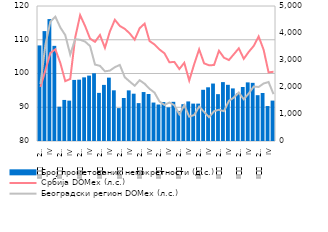
| Category | Број прометованих непокретности (д.с.) |
|---|---|
| II
     2008. | 3540 |
| III | 4071 |
| IV | 4515 |
| I
2009. | 3524 |
| II
     2009. | 1271 |
| III | 1521 |
| IV
 | 1495 |
| I
2010. | 2262 |
| II
     2010. | 2272 |
| III | 2357 |
| IV | 2422 |
| I
2011. | 2508 |
| II
     2011. | 1782 |
| III | 2078 |
| IV | 2347 |
| I
2012. | 1877 |
| II
     2012. | 1218 |
| III | 1592 |
| IV | 1875 |
| I
2013. | 1752 |
| II
     2013. | 1403 |
| III | 1813 |
| IV | 1741 |
| I
2014. | 1424 |
| II
     2014. | 1351 |
| III | 1443 |
| IV | 1247 |
| I
2015. | 1451 |
| II
     2015. | 1113 |
| III | 1363 |
| IV | 1466 |
| I
2016. | 1385 |
| II
     2016. | 1384 |
| III | 1897 |
| IV | 1989 |
| I
2017. | 2128 |
| II
     2017. | 1735 |
| III | 2181 |
| IV | 2081 |
| I
2018. | 1948 |
| II
     2018. | 1765 |
| III | 1999 |
| IV | 2171 |
| I
2019. | 2154 |
| II
     2019. | 1697 |
| III | 1778 |
| IV | 1295 |